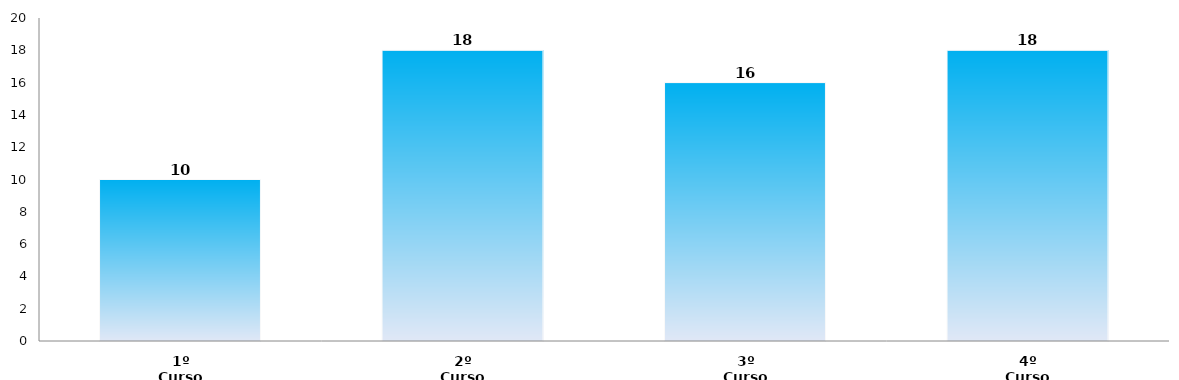
| Category | Series 0 |
|---|---|
| 1º Curso | 10 |
| 2º Curso | 18 |
| 3º Curso | 16 |
| 4º Curso | 18 |